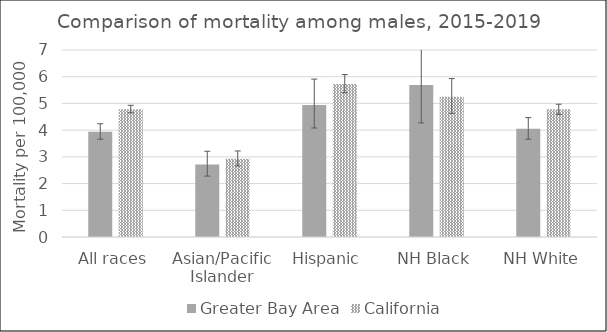
| Category | Greater Bay Area | California | US Mortality |
|---|---|---|---|
| All races | 3.94 | 4.78 |  |
| Asian/Pacific Islander | 2.71 | 2.93 |  |
| Hispanic | 4.94 | 5.73 |  |
| NH Black | 5.69 | 5.25 |  |
| NH White | 4.05 | 4.78 |  |